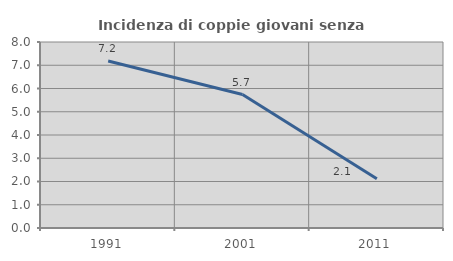
| Category | Incidenza di coppie giovani senza figli |
|---|---|
| 1991.0 | 7.179 |
| 2001.0 | 5.74 |
| 2011.0 | 2.119 |